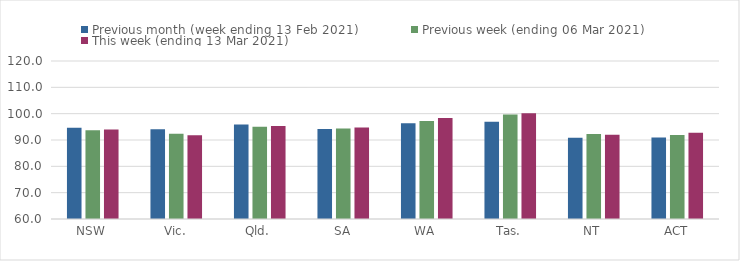
| Category | Previous month (week ending 13 Feb 2021) | Previous week (ending 06 Mar 2021) | This week (ending 13 Mar 2021) |
|---|---|---|---|
| NSW | 94.69 | 93.72 | 94.01 |
| Vic. | 94.06 | 92.41 | 91.83 |
| Qld. | 95.9 | 95 | 95.36 |
| SA | 94.16 | 94.38 | 94.74 |
| WA | 96.39 | 97.18 | 98.38 |
| Tas. | 96.95 | 99.67 | 100.16 |
| NT | 90.86 | 92.31 | 91.99 |
| ACT | 90.96 | 91.93 | 92.79 |